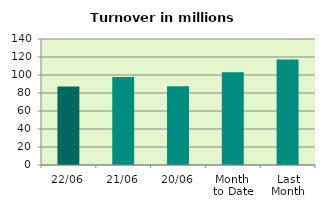
| Category | Series 0 |
|---|---|
| 22/06 | 87.167 |
| 21/06 | 97.898 |
| 20/06 | 87.391 |
| Month 
to Date | 103.102 |
| Last
Month | 117.306 |